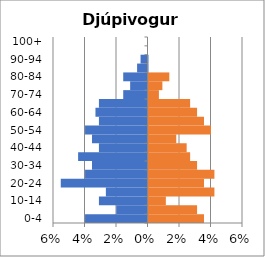
| Category | % Men | % Women |
|---|---|---|
| 0-4 | -0.04 | 0.035 |
| 5-9 | -0.02 | 0.031 |
| 10-14 | -0.031 | 0.011 |
| 15-19 | -0.026 | 0.042 |
| 20-24 | -0.055 | 0.035 |
| 25-29 | -0.04 | 0.042 |
| 30-34 | -0.035 | 0.031 |
| 35-39 | -0.044 | 0.026 |
| 40-44 | -0.031 | 0.024 |
| 45-49 | -0.035 | 0.018 |
| 50-54 | -0.04 | 0.04 |
| 55-59 | -0.031 | 0.035 |
| 60-64 | -0.033 | 0.031 |
| 65-69 | -0.031 | 0.026 |
| 70-74 | -0.015 | 0.007 |
| 75-79 | -0.011 | 0.009 |
| 80-84 | -0.015 | 0.013 |
| 85-89 | -0.007 | 0 |
| 90-94 | -0.004 | 0 |
| 95-99 | 0 | 0 |
| 100+ | 0 | 0 |